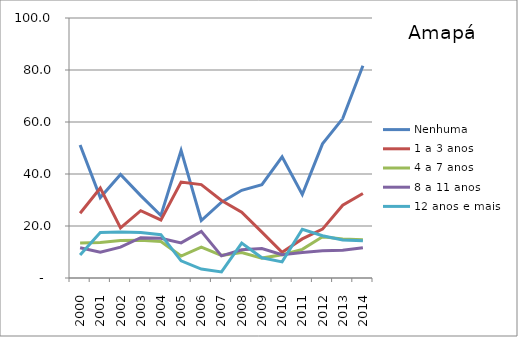
| Category | Nenhuma | 1 a 3 anos | 4 a 7 anos | 8 a 11 anos | 12 anos e mais |
|---|---|---|---|---|---|
| 2000.0 | 51.151 | 24.925 | 13.49 | 11.659 | 8.863 |
| 2001.0 | 30.928 | 34.581 | 13.654 | 9.962 | 17.467 |
| 2002.0 | 39.807 | 19.277 | 14.436 | 11.875 | 17.668 |
| 2003.0 | 31.679 | 25.901 | 14.546 | 15.505 | 17.479 |
| 2004.0 | 24.02 | 22.336 | 14.066 | 15.31 | 16.652 |
| 2005.0 | 49.08 | 36.872 | 8.451 | 13.51 | 6.59 |
| 2006.0 | 22.117 | 35.915 | 11.892 | 17.934 | 3.449 |
| 2007.0 | 29.173 | 29.82 | 8.715 | 8.507 | 2.35 |
| 2008.0 | 33.727 | 25.307 | 9.809 | 10.827 | 13.409 |
| 2009.0 | 35.912 | 17.662 | 7.656 | 11.338 | 7.761 |
| 2010.0 | 46.595 | 9.865 | 8.933 | 8.963 | 6.193 |
| 2011.0 | 32.129 | 15.03 | 11.016 | 9.83 | 18.735 |
| 2012.0 | 51.587 | 18.801 | 15.853 | 10.479 | 16.26 |
| 2013.0 | 61.321 | 28.015 | 15.019 | 10.632 | 14.629 |
| 2014.0 | 81.633 | 32.52 | 14.702 | 11.609 | 14.286 |